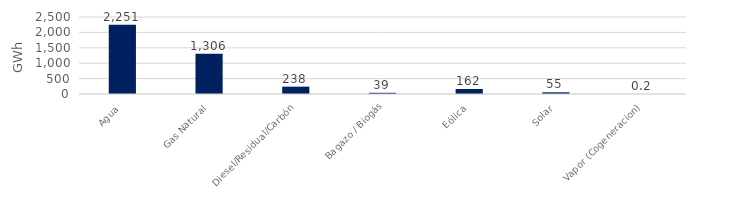
| Category | Series 0 |
|---|---|
| Agua | 2250.568 |
| Gas Natural | 1306.263 |
| Diesel/Residual/Carbón | 238.005 |
| Bagazo / Biogás | 38.855 |
| Eólica | 161.987 |
| Solar | 55.071 |
| Vapor (Cogeneracion) | 0.227 |